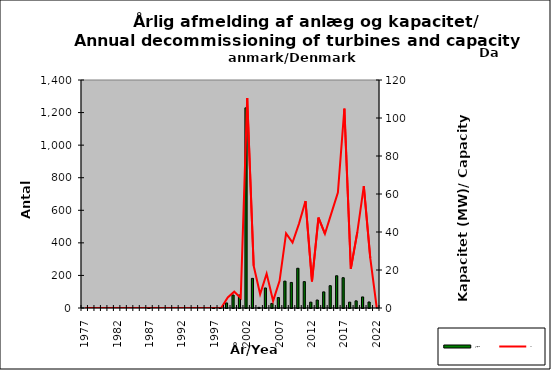
| Category | Antal/No |
|---|---|
| 1977.0 | 0 |
| 1978.0 | 0 |
| 1979.0 | 0 |
| 1980.0 | 0 |
| 1981.0 | 0 |
| 1982.0 | 0 |
| 1983.0 | 0 |
| 1984.0 | 0 |
| 1985.0 | 0 |
| 1986.0 | 0 |
| 1987.0 | 1 |
| 1988.0 | 0 |
| 1989.0 | 0 |
| 1990.0 | 0 |
| 1991.0 | 0 |
| 1992.0 | 0 |
| 1993.0 | 0 |
| 1994.0 | 0 |
| 1995.0 | 0 |
| 1996.0 | 0 |
| 1997.0 | 1 |
| 1998.0 | 3 |
| 1999.0 | 31 |
| 2000.0 | 80 |
| 2001.0 | 80 |
| 2002.0 | 1229 |
| 2003.0 | 182 |
| 2004.0 | 4 |
| 2005.0 | 123 |
| 2006.0 | 28 |
| 2007.0 | 64 |
| 2008.0 | 165 |
| 2009.0 | 157 |
| 2010.0 | 244 |
| 2011.0 | 162 |
| 2012.0 | 36 |
| 2013.0 | 49 |
| 2014.0 | 99 |
| 2015.0 | 137 |
| 2016.0 | 198 |
| 2017.0 | 186 |
| 2018.0 | 36 |
| 2019.0 | 44 |
| 2020.0 | 68 |
| 2021.0 | 37 |
| 2022.0 | 0 |